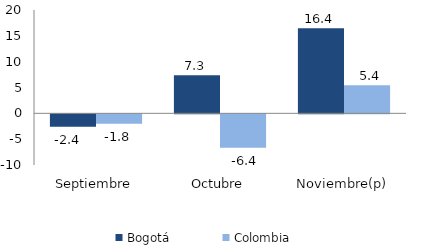
| Category | Bogotá | Colombia |
|---|---|---|
| Septiembre | -2.411 | -1.815 |
| Octubre | 7.349 | -6.444 |
| Noviembre(p) | 16.447 | 5.419 |